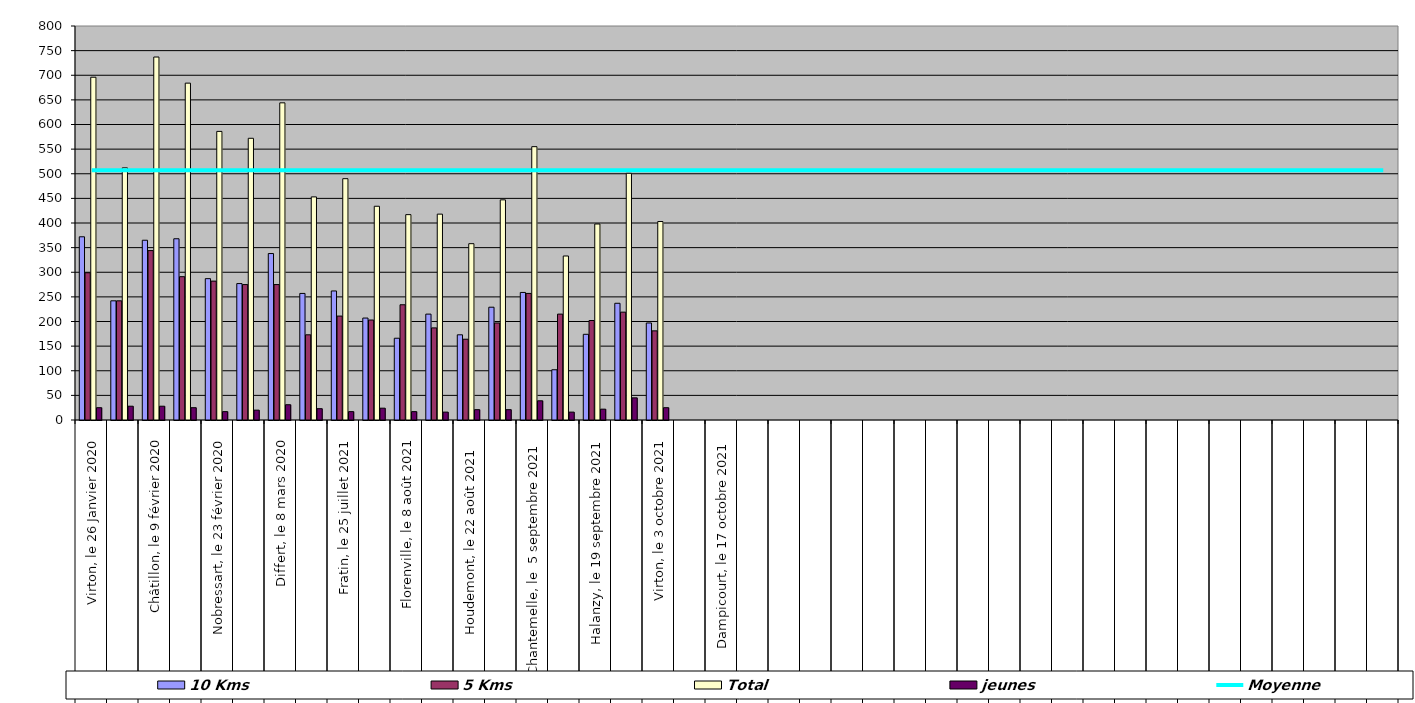
| Category | 10 Kms | 5 Kms | Total | jeunes |
|---|---|---|---|---|
| 0 | 372 | 299 | 696 | 25 |
| 1 | 242 | 242 | 512 | 28 |
| 2 | 365 | 344 | 737 | 28 |
| 3 | 368 | 291 | 684 | 25 |
| 4 | 287 | 282 | 586 | 17 |
| 5 | 277 | 275 | 572 | 20 |
| 6 | 338 | 275 | 644 | 31 |
| 7 | 257 | 173 | 453 | 23 |
| 8 | 262 | 211 | 490 | 17 |
| 9 | 207 | 203 | 434 | 24 |
| 10 | 166 | 234 | 417 | 17 |
| 11 | 215 | 187 | 418 | 16 |
| 12 | 173 | 164 | 358 | 21 |
| 13 | 229 | 197 | 447 | 21 |
| 14 | 259 | 257 | 555 | 39 |
| 15 | 102 | 215 | 333 | 16 |
| 16 | 174 | 202 | 398 | 22 |
| 17 | 237 | 219 | 501 | 45 |
| 18 | 197 | 181 | 403 | 25 |
| 19 | 0 | 0 | 0 | 0 |
| 20 | 0 | 0 | 0 | 0 |
| 21 | 0 | 0 | 0 | 0 |
| 22 | 0 | 0 | 0 | 0 |
| 23 | 0 | 0 | 0 | 0 |
| 24 | 0 | 0 | 0 | 0 |
| 25 | 0 | 0 | 0 | 0 |
| 26 | 0 | 0 | 0 | 0 |
| 27 | 0 | 0 | 0 | 0 |
| 28 | 0 | 0 | 0 | 0 |
| 29 | 0 | 0 | 0 | 0 |
| 30 | 0 | 0 | 0 | 0 |
| 31 | 0 | 0 | 0 | 0 |
| 32 | 0 | 0 | 0 | 0 |
| 33 | 0 | 0 | 0 | 0 |
| 34 | 0 | 0 | 0 | 0 |
| 35 | 0 | 0 | 0 | 0 |
| 36 | 0 | 0 | 0 | 0 |
| 37 | 0 | 0 | 0 | 0 |
| 38 | 0 | 0 | 0 | 0 |
| 39 | 0 | 0 | 0 | 0 |
| 40 | 0 | 0 | 0 | 0 |
| 41 | 0 | 0 | 0 | 0 |